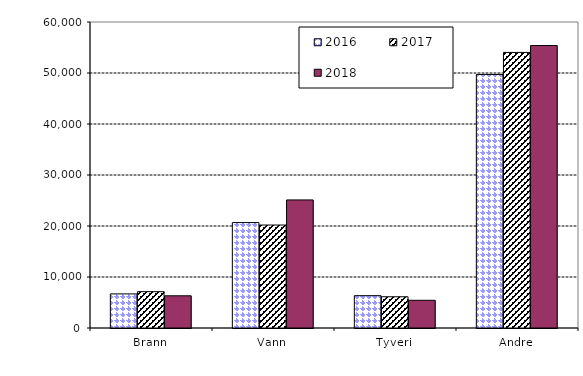
| Category | 2016 | 2017 | 2018 |
|---|---|---|---|
| Brann | 6682.536 | 7124.257 | 6317.398 |
| Vann | 20668.166 | 20188.971 | 25111.389 |
| Tyveri | 6340.736 | 6121.382 | 5432.86 |
| Andre | 49716.318 | 54035.703 | 55384.087 |